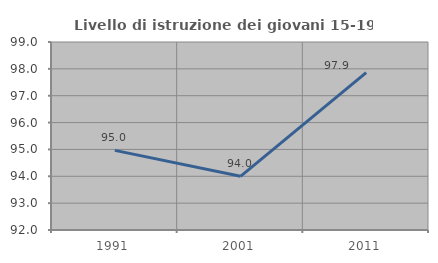
| Category | Livello di istruzione dei giovani 15-19 anni |
|---|---|
| 1991.0 | 94.964 |
| 2001.0 | 94 |
| 2011.0 | 97.857 |